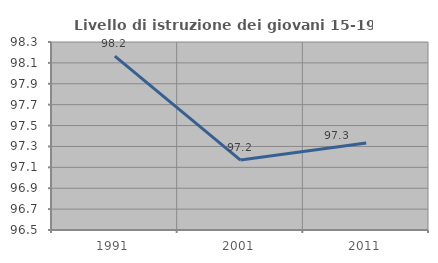
| Category | Livello di istruzione dei giovani 15-19 anni |
|---|---|
| 1991.0 | 98.165 |
| 2001.0 | 97.17 |
| 2011.0 | 97.333 |